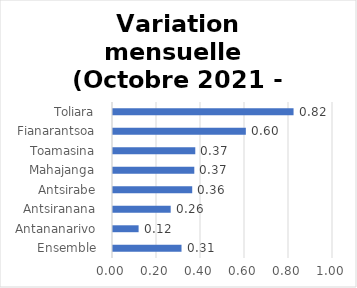
| Category | Variation mensuelle |
|---|---|
|  Ensemble  | 0.311 |
|  Antananarivo  | 0.116 |
|  Antsiranana  | 0.262 |
|  Antsirabe  | 0.36 |
|  Mahajanga  | 0.37 |
|  Toamasina  | 0.374 |
|  Fianarantsoa  | 0.604 |
|  Toliara  | 0.821 |